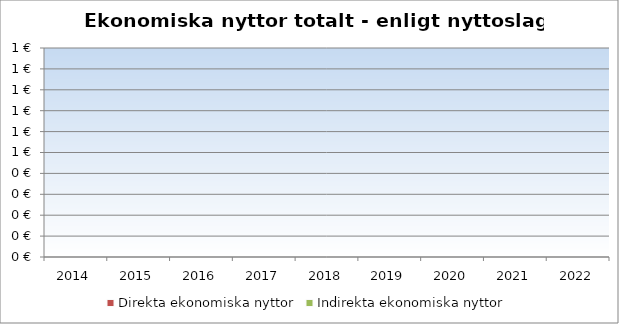
| Category | Direkta ekonomiska nyttor | Indirekta ekonomiska nyttor |
|---|---|---|
| 2014.0 | 0 | 0 |
| 2015.0 | 0 | 0 |
| 2016.0 | 0 | 0 |
| 2017.0 | 0 | 0 |
| 2018.0 | 0 | 0 |
| 2019.0 | 0 | 0 |
| 2020.0 | 0 | 0 |
| 2021.0 | 0 | 0 |
| 2022.0 | 0 | 0 |